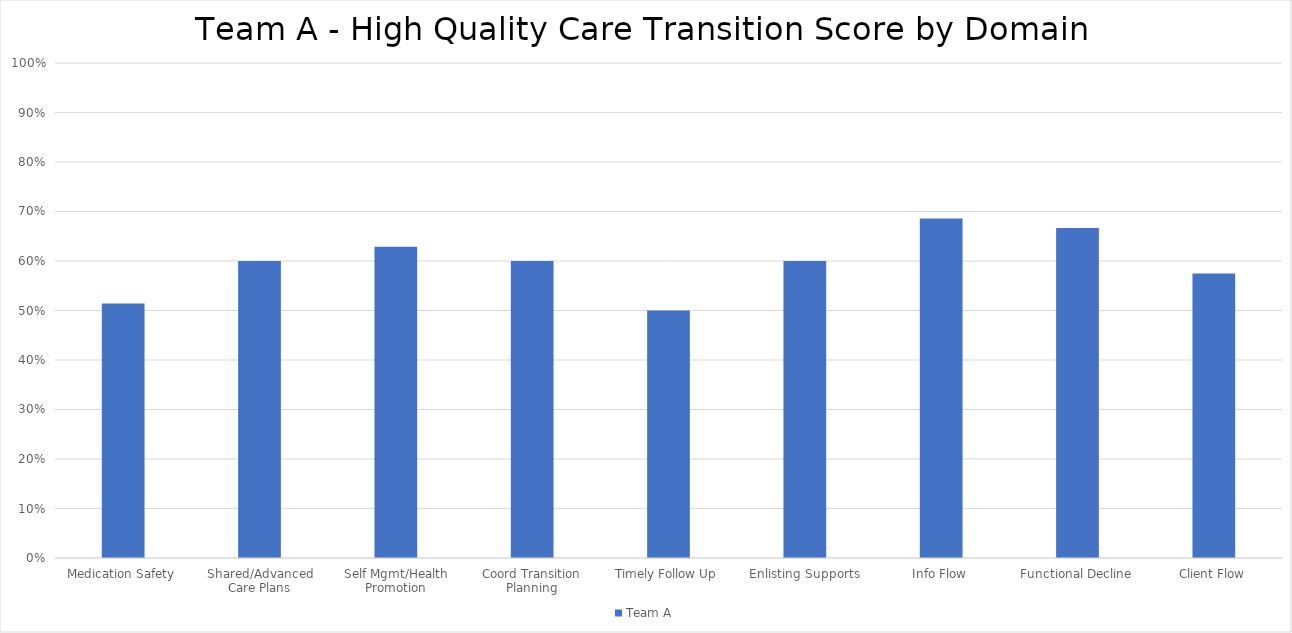
| Category | Team A |
|---|---|
| Medication Safety | 0.514 |
| Shared/Advanced Care Plans | 0.6 |
| Self Mgmt/Health Promotion | 0.629 |
| Coord Transition Planning | 0.6 |
| Timely Follow Up | 0.5 |
| Enlisting Supports | 0.6 |
| Info Flow | 0.686 |
| Functional Decline | 0.667 |
| Client Flow | 0.575 |